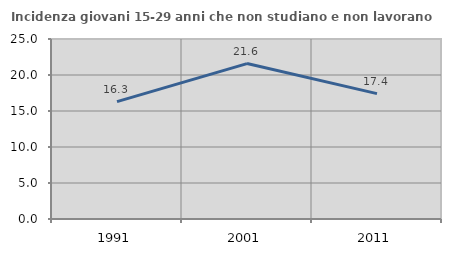
| Category | Incidenza giovani 15-29 anni che non studiano e non lavorano  |
|---|---|
| 1991.0 | 16.304 |
| 2001.0 | 21.587 |
| 2011.0 | 17.418 |